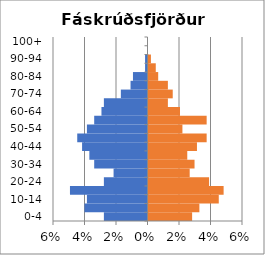
| Category | % Men | % Women |
|---|---|---|
| 0-4 | -0.028 | 0.028 |
| 5-9 | -0.04 | 0.032 |
| 10-14 | -0.038 | 0.045 |
| 15-19 | -0.049 | 0.048 |
| 20-24 | -0.028 | 0.038 |
| 25-29 | -0.022 | 0.026 |
| 30-34 | -0.034 | 0.029 |
| 35-39 | -0.037 | 0.025 |
| 40-44 | -0.042 | 0.031 |
| 45-49 | -0.045 | 0.037 |
| 50-54 | -0.038 | 0.022 |
| 55-59 | -0.034 | 0.037 |
| 60-64 | -0.029 | 0.02 |
| 65-69 | -0.028 | 0.012 |
| 70-74 | -0.017 | 0.015 |
| 75-79 | -0.011 | 0.012 |
| 80-84 | -0.009 | 0.006 |
| 85-89 | -0.002 | 0.005 |
| 90-94 | -0.002 | 0.002 |
| 95-99 | 0 | 0 |
| 100+ | 0 | 0 |